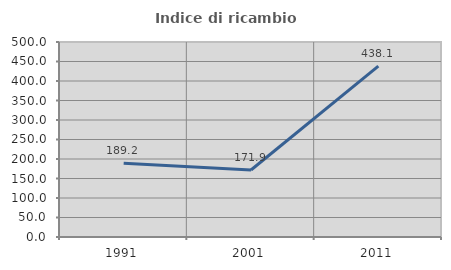
| Category | Indice di ricambio occupazionale  |
|---|---|
| 1991.0 | 189.231 |
| 2001.0 | 171.856 |
| 2011.0 | 438.095 |